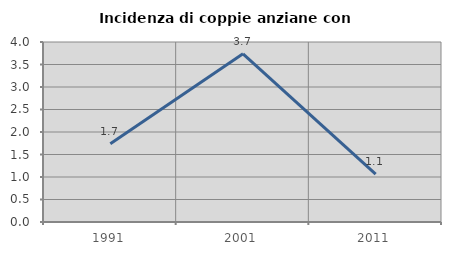
| Category | Incidenza di coppie anziane con figli |
|---|---|
| 1991.0 | 1.739 |
| 2001.0 | 3.738 |
| 2011.0 | 1.064 |